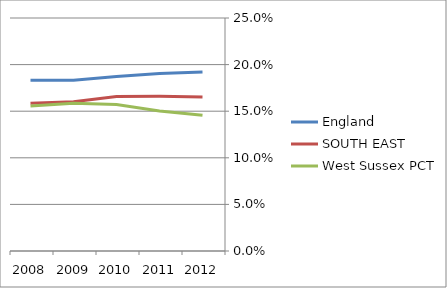
| Category | England | SOUTH EAST  | West Sussex PCT |
|---|---|---|---|
| 2012.0 | 0.192 | 0.165 | 0.146 |
| 2011.0 | 0.19 | 0.166 | 0.15 |
| 2010.0 | 0.187 | 0.166 | 0.157 |
| 2009.0 | 0.183 | 0.16 | 0.159 |
| 2008.0 | 0.183 | 0.158 | 0.156 |